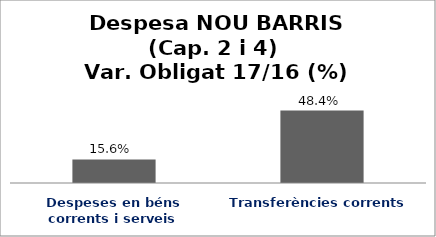
| Category | Series 0 |
|---|---|
| Despeses en béns corrents i serveis | 0.156 |
| Transferències corrents | 0.484 |